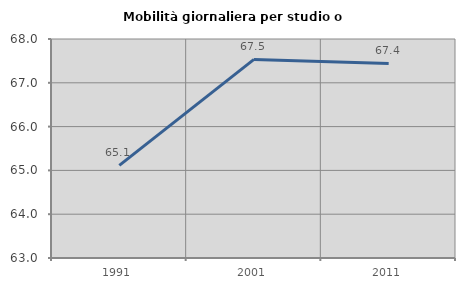
| Category | Mobilità giornaliera per studio o lavoro |
|---|---|
| 1991.0 | 65.114 |
| 2001.0 | 67.534 |
| 2011.0 | 67.443 |